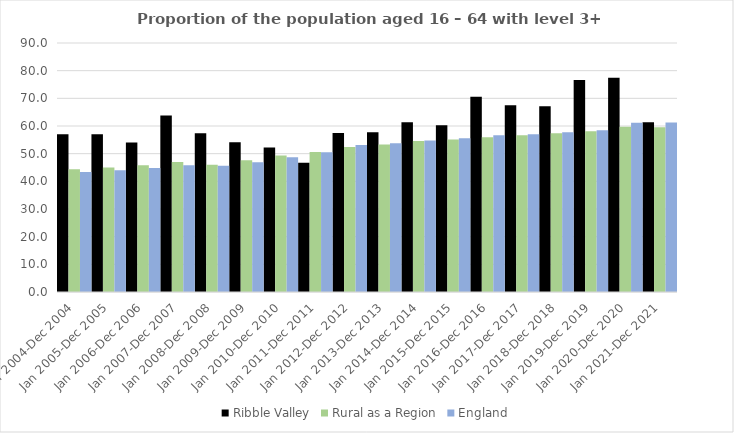
| Category | Ribble Valley | Rural as a Region | England |
|---|---|---|---|
| Jan 2004-Dec 2004 | 57 | 44.405 | 43.4 |
| Jan 2005-Dec 2005 | 57 | 44.973 | 44 |
| Jan 2006-Dec 2006 | 54 | 45.774 | 44.8 |
| Jan 2007-Dec 2007 | 63.8 | 46.968 | 45.8 |
| Jan 2008-Dec 2008 | 57.4 | 45.964 | 45.6 |
| Jan 2009-Dec 2009 | 54.1 | 47.59 | 46.9 |
| Jan 2010-Dec 2010 | 52.2 | 49.362 | 48.7 |
| Jan 2011-Dec 2011 | 46.7 | 50.602 | 50.5 |
| Jan 2012-Dec 2012 | 57.5 | 52.439 | 53.1 |
| Jan 2013-Dec 2013 | 57.7 | 53.276 | 53.8 |
| Jan 2014-Dec 2014 | 61.4 | 54.57 | 54.8 |
| Jan 2015-Dec 2015 | 60.3 | 55.16 | 55.6 |
| Jan 2016-Dec 2016 | 70.6 | 55.941 | 56.7 |
| Jan 2017-Dec 2017 | 67.5 | 56.689 | 57 |
| Jan 2018-Dec 2018 | 67.1 | 57.389 | 57.7 |
| Jan 2019-Dec 2019 | 76.6 | 58.147 | 58.5 |
| Jan 2020-Dec 2020 | 77.4 | 59.771 | 61.2 |
| Jan 2021-Dec 2021 | 61.4 | 59.54 | 61.3 |